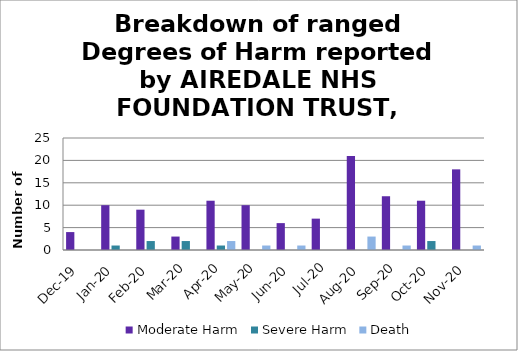
| Category | Moderate Harm | Severe Harm | Death |
|---|---|---|---|
| Dec-19 | 4 | 0 | 0 |
| Jan-20 | 10 | 1 | 0 |
| Feb-20 | 9 | 2 | 0 |
| Mar-20 | 3 | 2 | 0 |
| Apr-20 | 11 | 1 | 2 |
| May-20 | 10 | 0 | 1 |
| Jun-20 | 6 | 0 | 1 |
| Jul-20 | 7 | 0 | 0 |
| Aug-20 | 21 | 0 | 3 |
| Sep-20 | 12 | 0 | 1 |
| Oct-20 | 11 | 2 | 0 |
| Nov-20 | 18 | 0 | 1 |